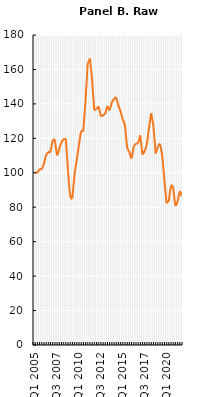
| Category | Series 1 |
|---|---|
| Q1 2005 | 100 |
| Q2 2005 | 100.169 |
| Q3 2005 | 101.896 |
| Q4 2005 | 102.191 |
| Q1 2006 | 105.183 |
| Q2 2006 | 110.029 |
| Q3 2006 | 111.968 |
| Q4 2006 | 112.347 |
| Q1 2007 | 118.373 |
| Q2 2007 | 118.668 |
| Q3 2007 | 110.535 |
| Q4 2007 | 113.906 |
| Q1 2008 | 117.488 |
| Q2 2008 | 119.385 |
| Q3 2008 | 119.89 |
| Q4 2008 | 101.475 |
| Q1 2009 | 87.021 |
| Q2 2009 | 86.304 |
| Q3 2009 | 99.157 |
| Q4 2009 | 107.206 |
| Q1 2010 | 116.182 |
| Q2 2010 | 123.683 |
| Q3 2010 | 124.231 |
| Q4 2010 | 141.593 |
| Q1 2011 | 163.211 |
| Q2 2011 | 166.33 |
| Q3 2011 | 154.488 |
| Q4 2011 | 136.241 |
| Q1 2012 | 137 |
| Q2 2012 | 138.053 |
| Q3 2012 | 133.249 |
| Q4 2012 | 133.418 |
| Q1 2013 | 134.555 |
| Q2 2013 | 138.432 |
| Q3 2013 | 136.452 |
| Q4 2013 | 140.834 |
| Q1 2014 | 142.773 |
| Q2 2014 | 143.447 |
| Q3 2014 | 139.191 |
| Q4 2014 | 135.651 |
| Q1 2015 | 130.973 |
| Q2 2015 | 127.307 |
| Q3 2015 | 115.129 |
| Q4 2015 | 112.094 |
| Q1 2016 | 108.681 |
| Q2 2016 | 114.876 |
| Q3 2016 | 116.772 |
| Q4 2016 | 117.488 |
| Q1 2017 | 121.702 |
| Q2 2017 | 110.536 |
| Q3 2017 | 112.643 |
| Q4 2017 | 116.756 |
| Q1 2018 | 126.258 |
| Q2 2018 | 134.645 |
| Q3 2018 | 127.191 |
| Q4 2018 | 111.238 |
| Q1 2019 | 115.05 |
| Q2 2019 | 116.402 |
| Q3 2019 | 109.658 |
| Q4 2019 | 95.877 |
| Q1 2020 | 82.338 |
| Q2 2020 | 83.575 |
| Q3 2020 | 91.959 |
| Q4 2020 | 91.075 |
| 01/01/2021 | 81.42 |
| 01/02/2021 | 83.335 |
| 01/03/2021 | 89.016 |
| 01/08/2021 | 86.268 |